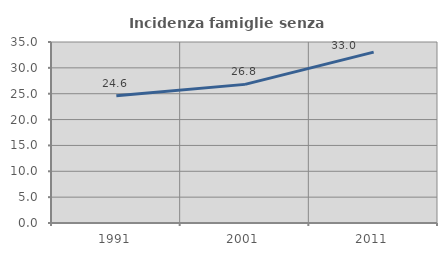
| Category | Incidenza famiglie senza nuclei |
|---|---|
| 1991.0 | 24.615 |
| 2001.0 | 26.805 |
| 2011.0 | 33.043 |